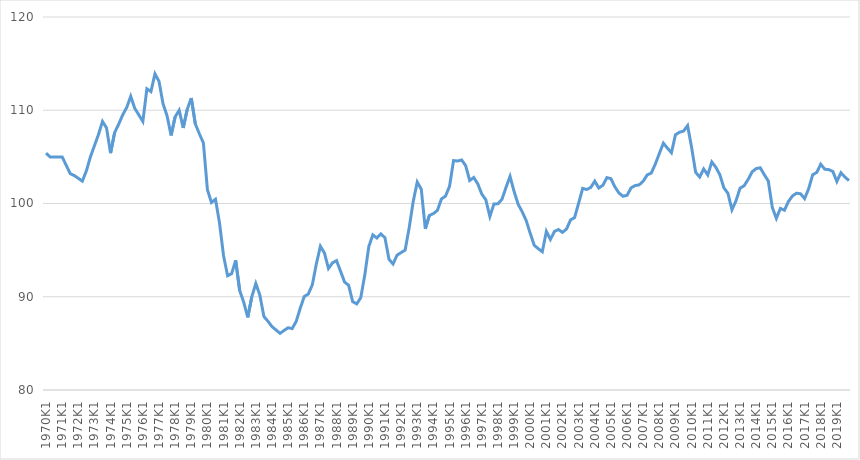
| Category | Nominel effektiv kronekurs (Jan. 1970-) |
|---|---|
| 1970K1 | 105.4 |
| 1970K2 | 105 |
| 1970K3 | 105 |
| 1970K4 | 105 |
| 1971K1 | 105 |
| 1971K2 | 104.1 |
| 1971K3 | 103.2 |
| 1971K4 | 103 |
| 1972K1 | 102.7 |
| 1972K2 | 102.4 |
| 1972K3 | 103.5 |
| 1972K4 | 105 |
| 1973K1 | 106.2 |
| 1973K2 | 107.4 |
| 1973K3 | 108.8 |
| 1973K4 | 108.1 |
| 1974K1 | 105.4 |
| 1974K2 | 107.6 |
| 1974K3 | 108.5 |
| 1974K4 | 109.5 |
| 1975K1 | 110.3 |
| 1975K2 | 111.5 |
| 1975K3 | 110.2 |
| 1975K4 | 109.5 |
| 1976K1 | 108.8 |
| 1976K2 | 112.3 |
| 1976K3 | 112 |
| 1976K4 | 113.9 |
| 1977K1 | 113.1 |
| 1977K2 | 110.7 |
| 1977K3 | 109.4 |
| 1977K4 | 107.3 |
| 1978K1 | 109.3 |
| 1978K2 | 110 |
| 1978K3 | 108.1 |
| 1978K4 | 110.1 |
| 1979K1 | 111.31 |
| 1979K2 | 108.53 |
| 1979K3 | 107.479 |
| 1979K4 | 106.507 |
| 1980K1 | 101.485 |
| 1980K2 | 100.117 |
| 1980K3 | 100.448 |
| 1980K4 | 97.907 |
| 1981K1 | 94.394 |
| 1981K2 | 92.26 |
| 1981K3 | 92.477 |
| 1981K4 | 93.906 |
| 1982K1 | 90.663 |
| 1982K2 | 89.406 |
| 1982K3 | 87.789 |
| 1982K4 | 89.993 |
| 1983K1 | 91.418 |
| 1983K2 | 90.166 |
| 1983K3 | 87.877 |
| 1983K4 | 87.376 |
| 1984K1 | 86.796 |
| 1984K2 | 86.439 |
| 1984K3 | 86.075 |
| 1984K4 | 86.389 |
| 1985K1 | 86.674 |
| 1985K2 | 86.586 |
| 1985K3 | 87.351 |
| 1985K4 | 88.764 |
| 1986K1 | 90.031 |
| 1986K2 | 90.291 |
| 1986K3 | 91.278 |
| 1986K4 | 93.526 |
| 1987K1 | 95.417 |
| 1987K2 | 94.692 |
| 1987K3 | 93.033 |
| 1987K4 | 93.635 |
| 1988K1 | 93.872 |
| 1988K2 | 92.73 |
| 1988K3 | 91.575 |
| 1988K4 | 91.23 |
| 1989K1 | 89.474 |
| 1989K2 | 89.235 |
| 1989K3 | 89.894 |
| 1989K4 | 92.336 |
| 1990K1 | 95.388 |
| 1990K2 | 96.635 |
| 1990K3 | 96.301 |
| 1990K4 | 96.742 |
| 1991K1 | 96.324 |
| 1991K2 | 94.02 |
| 1991K3 | 93.514 |
| 1991K4 | 94.461 |
| 1992K1 | 94.739 |
| 1992K2 | 95.005 |
| 1992K3 | 97.388 |
| 1992K4 | 100.21 |
| 1993K1 | 102.303 |
| 1993K2 | 101.534 |
| 1993K3 | 97.278 |
| 1993K4 | 98.716 |
| 1994K1 | 98.917 |
| 1994K2 | 99.262 |
| 1994K3 | 100.493 |
| 1994K4 | 100.787 |
| 1995K1 | 101.834 |
| 1995K2 | 104.603 |
| 1995K3 | 104.557 |
| 1995K4 | 104.667 |
| 1996K1 | 104.061 |
| 1996K2 | 102.465 |
| 1996K3 | 102.788 |
| 1996K4 | 102.11 |
| 1997K1 | 101.01 |
| 1997K2 | 100.395 |
| 1997K3 | 98.609 |
| 1997K4 | 99.945 |
| 1998K1 | 99.968 |
| 1998K2 | 100.453 |
| 1998K3 | 101.725 |
| 1998K4 | 102.913 |
| 1999K1 | 101.294 |
| 1999K2 | 99.931 |
| 1999K3 | 99.118 |
| 1999K4 | 98.18 |
| 2000K1 | 96.799 |
| 2000K2 | 95.513 |
| 2000K3 | 95.153 |
| 2000K4 | 94.828 |
| 2001K1 | 97.008 |
| 2001K2 | 96.144 |
| 2001K3 | 97.001 |
| 2001K4 | 97.208 |
| 2002K1 | 96.904 |
| 2002K2 | 97.268 |
| 2002K3 | 98.244 |
| 2002K4 | 98.49 |
| 2003K1 | 100.035 |
| 2003K2 | 101.624 |
| 2003K3 | 101.499 |
| 2003K4 | 101.716 |
| 2004K1 | 102.397 |
| 2004K2 | 101.659 |
| 2004K3 | 101.948 |
| 2004K4 | 102.773 |
| 2005K1 | 102.667 |
| 2005K2 | 101.766 |
| 2005K3 | 101.124 |
| 2005K4 | 100.78 |
| 2006K1 | 100.874 |
| 2006K2 | 101.678 |
| 2006K3 | 101.926 |
| 2006K4 | 101.996 |
| 2007K1 | 102.394 |
| 2007K2 | 103.071 |
| 2007K3 | 103.26 |
| 2007K4 | 104.227 |
| 2008K1 | 105.363 |
| 2008K2 | 106.47 |
| 2008K3 | 105.943 |
| 2008K4 | 105.443 |
| 2009K1 | 107.372 |
| 2009K2 | 107.643 |
| 2009K3 | 107.767 |
| 2009K4 | 108.352 |
| 2010K1 | 106.004 |
| 2010K2 | 103.339 |
| 2010K3 | 102.841 |
| 2010K4 | 103.701 |
| 2011K1 | 103.063 |
| 2011K2 | 104.452 |
| 2011K3 | 103.889 |
| 2011K4 | 103.079 |
| 2012K1 | 101.677 |
| 2012K2 | 101.091 |
| 2012K3 | 99.327 |
| 2012K4 | 100.296 |
| 2013K1 | 101.639 |
| 2013K2 | 101.898 |
| 2013K3 | 102.573 |
| 2013K4 | 103.397 |
| 2014K1 | 103.744 |
| 2014K2 | 103.833 |
| 2014K3 | 103.096 |
| 2014K4 | 102.411 |
| 2015K1 | 99.575 |
| 2015K2 | 98.403 |
| 2015K3 | 99.471 |
| 2015K4 | 99.28 |
| 2016K1 | 100.216 |
| 2016K2 | 100.813 |
| 2016K3 | 101.104 |
| 2016K4 | 101.042 |
| 2017K1 | 100.522 |
| 2017K2 | 101.576 |
| 2017K3 | 103.08 |
| 2017K4 | 103.331 |
| 2018K1 | 104.21 |
| 2018K2 | 103.68 |
| 2018K3 | 103.63 |
| 2018K4 | 103.44 |
| 2019K1 | 102.36 |
| 2019K2 | 103.3 |
| 2019K3 | 102.83 |
| 2019K4 | 102.46 |